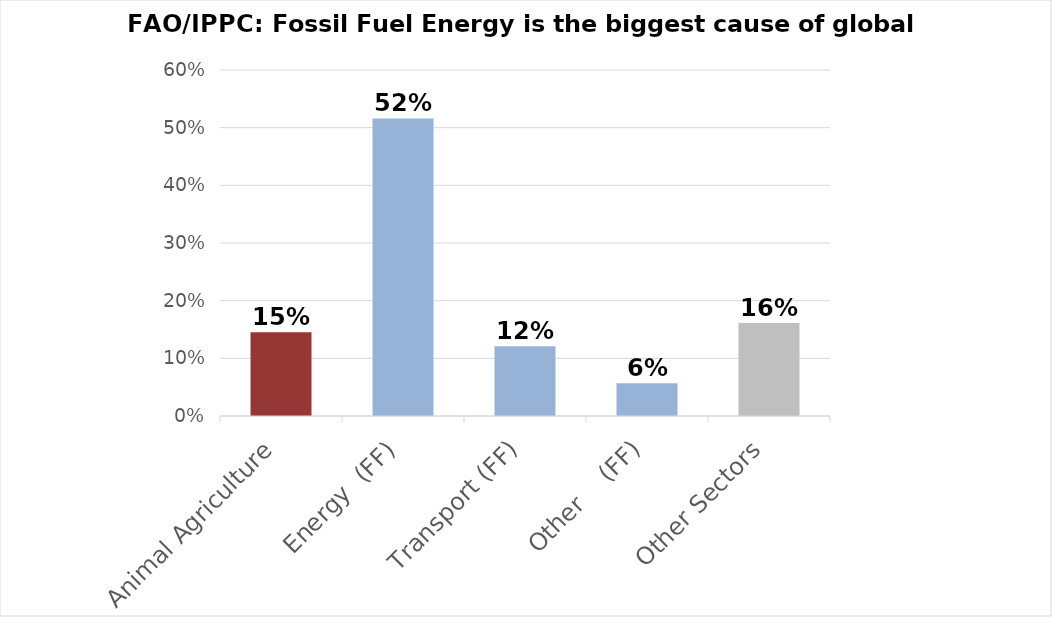
| Category | Series 0 |
|---|---|
| Animal Agriculture | 0.145 |
| Energy  (FF) | 0.516 |
| Transport (FF) | 0.121 |
| Other    (FF) | 0.057 |
| Other Sectors | 0.161 |